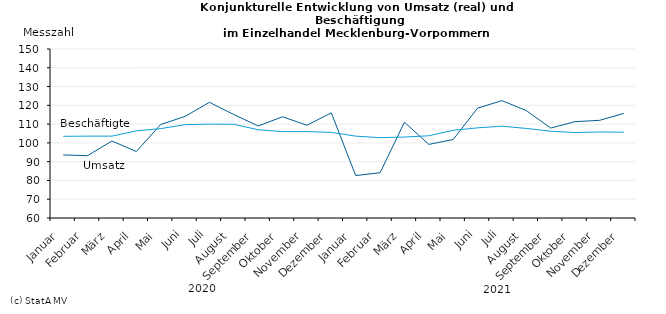
| Category | Umsatz | Beschäftigte |
|---|---|---|
|   Januar  | 93.6 | 103.5 |
|   Februar  | 93.2 | 103.6 |
|   März  | 101 | 103.6 |
|   April  | 95.4 | 106.4 |
|   Mai  | 109.8 | 107.6 |
|   Juni  | 114.1 | 109.7 |
|   Juli  | 121.6 | 110 |
|   August  | 115.1 | 109.9 |
|   September  | 109 | 107 |
|   Oktober  | 113.9 | 106 |
|   November  | 109.4 | 106 |
|   Dezember  | 116 | 105.6 |
|   Januar  | 82.6 | 103.6 |
|   Februar  | 84.1 | 102.8 |
|   März  | 111 | 103.1 |
|   April  | 99.2 | 103.8 |
|   Mai  | 101.8 | 106.7 |
|   Juni  | 118.5 | 108 |
|   Juli  | 122.5 | 108.9 |
|   August  | 117.2 | 107.7 |
|   September  | 107.9 | 106.2 |
|   Oktober  | 111.3 | 105.5 |
|   November  | 112 | 105.8 |
|   Dezember  | 115.7 | 105.7 |